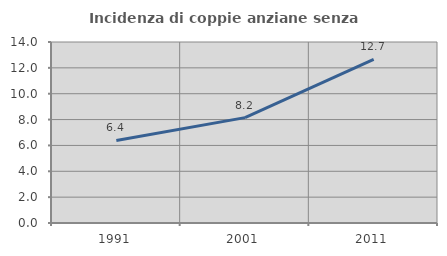
| Category | Incidenza di coppie anziane senza figli  |
|---|---|
| 1991.0 | 6.383 |
| 2001.0 | 8.152 |
| 2011.0 | 12.664 |